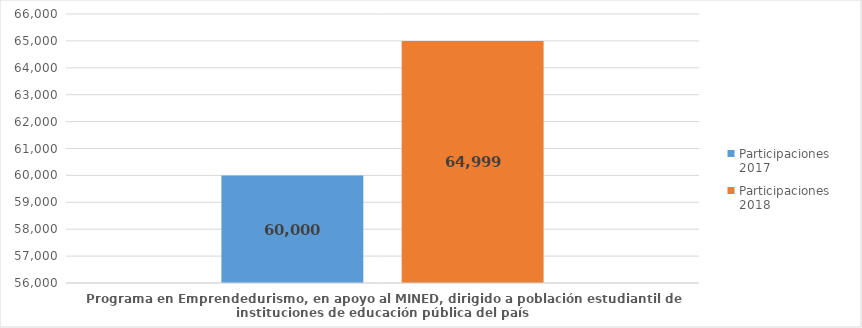
| Category | Participaciones 2017 | Participaciones 
2018 |
|---|---|---|
| Programa en Emprendedurismo, en apoyo al MINED, dirigido a población estudiantil de instituciones de educación pública del país | 60000 | 64999 |